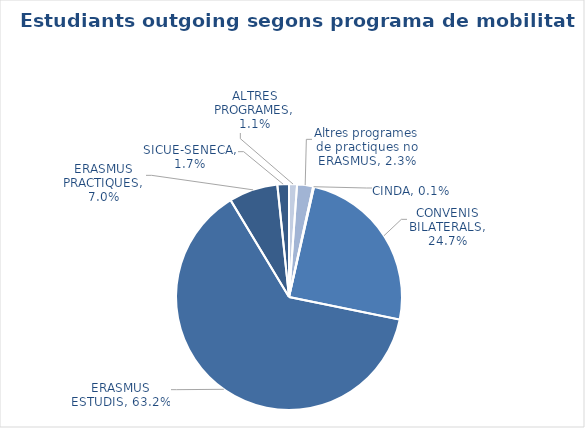
| Category | Estudiants outgoing segons programa de mobilitat |
|---|---|
| ALTRES PROGRAMES | 0.011 |
| Altres programes de practiques no ERASMUS | 0.023 |
| CINDA | 0.001 |
| CONVENIS BILATERALS | 0.247 |
| ERASMUS ESTUDIS | 0.632 |
| ERASMUS PRACTIQUES | 0.07 |
| SICUE-SENECA | 0.017 |